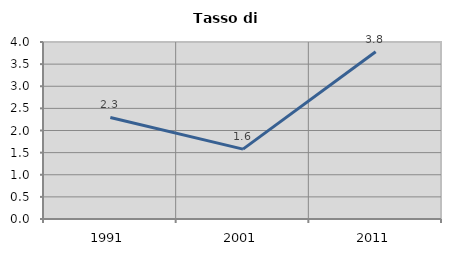
| Category | Tasso di disoccupazione   |
|---|---|
| 1991.0 | 2.295 |
| 2001.0 | 1.578 |
| 2011.0 | 3.781 |